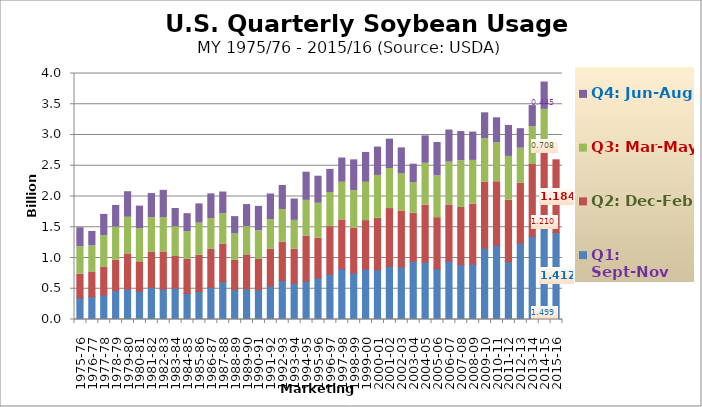
| Category | Q1: Sept-Nov | Q2: Dec-Feb | Q3: Mar-May | Q4: Jun-Aug |
|---|---|---|---|---|
| 1975-76 | 0.351 | 0.384 | 0.447 | 0.31 |
| 1976-77 | 0.37 | 0.404 | 0.424 | 0.233 |
| 1977-78 | 0.398 | 0.449 | 0.517 | 0.345 |
| 1978-79 | 0.471 | 0.494 | 0.539 | 0.351 |
| 1979-80 | 0.495 | 0.573 | 0.594 | 0.416 |
| 1980-81 | 0.46 | 0.478 | 0.537 | 0.368 |
| 1981-82 | 0.52 | 0.572 | 0.564 | 0.392 |
| 1982-83 | 0.494 | 0.605 | 0.555 | 0.446 |
| 1983-84 | 0.509 | 0.516 | 0.484 | 0.296 |
| 1984-85 | 0.422 | 0.555 | 0.452 | 0.292 |
| 1985-86 | 0.455 | 0.589 | 0.523 | 0.313 |
| 1986-87 | 0.522 | 0.618 | 0.502 | 0.4 |
| 1987-88 | 0.616 | 0.611 | 0.492 | 0.354 |
| 1988-89 | 0.486 | 0.477 | 0.427 | 0.283 |
| 1989-90 | 0.496 | 0.556 | 0.46 | 0.358 |
| 1990-91 | 0.482 | 0.494 | 0.468 | 0.396 |
| 1991-92 | 0.544 | 0.596 | 0.483 | 0.418 |
| 1992-93 | 0.633 | 0.621 | 0.532 | 0.391 |
| 1993-94 | 0.59 | 0.553 | 0.468 | 0.348 |
| 1994-95 | 0.624 | 0.733 | 0.58 | 0.458 |
| 1995-96 | 0.677 | 0.645 | 0.569 | 0.44 |
| 1996-97 | 0.739 | 0.77 | 0.556 | 0.375 |
| 1997-98 | 0.822 | 0.797 | 0.611 | 0.395 |
| 1998-99 | 0.756 | 0.73 | 0.609 | 0.501 |
| 1999-00 | 0.821 | 0.788 | 0.623 | 0.486 |
| 2000-01 | 0.809 | 0.837 | 0.697 | 0.461 |
| 2001-02 | 0.864 | 0.94 | 0.652 | 0.477 |
| 2002-03 | 0.85 | 0.914 | 0.601 | 0.425 |
| 2003-04 | 0.946 | 0.784 | 0.496 | 0.299 |
| 2004-05 | 0.933 | 0.925 | 0.683 | 0.446 |
| 2005-06 | 0.823 | 0.833 | 0.679 | 0.542 |
| 2006-07 | 0.946 | 0.916 | 0.697 | 0.521 |
| 2007-08 | 0.892 | 0.93 | 0.76 | 0.473 |
| 2008-09 | 0.899 | 0.978 | 0.709 | 0.46 |
| 2009-10 | 1.162 | 1.074 | 0.702 | 0.423 |
| 2010-11 | 1.206 | 1.034 | 0.632 | 0.407 |
| 2011-12 | 0.941 | 0.998 | 0.712 | 0.503 |
| 2012-13 | 1.241 | 0.973 | 0.571 | 0.318 |
| 2013-14 | 1.352 | 1.168 | 0.614 | 0.343 |
| 2014-15 | 1.499 | 1.21 | 0.708 | 0.445 |
| 2015-16 | 1.412 | 1.184 | 0 | 0 |